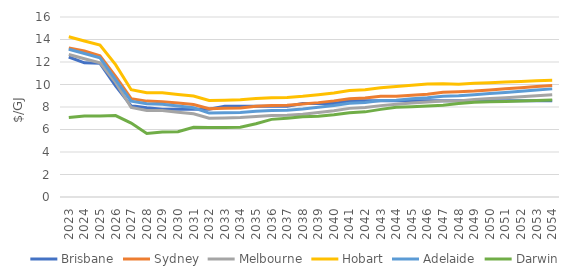
| Category | Brisbane | Sydney | Melbourne | Hobart | Adelaide | Darwin |
|---|---|---|---|---|---|---|
| 2023.0 | 12.443 | 13.236 | 12.663 | 14.242 | 13.139 | 7.075 |
| 2024.0 | 11.925 | 12.981 | 12.289 | 13.867 | 12.757 | 7.209 |
| 2025.0 | 11.88 | 12.56 | 11.934 | 13.513 | 12.367 | 7.206 |
| 2026.0 | 9.884 | 10.711 | 10.184 | 11.763 | 10.441 | 7.235 |
| 2027.0 | 8.104 | 8.745 | 7.957 | 9.54 | 8.515 | 6.574 |
| 2028.0 | 7.939 | 8.523 | 7.69 | 9.273 | 8.293 | 5.653 |
| 2029.0 | 7.806 | 8.475 | 7.683 | 9.266 | 8.254 | 5.783 |
| 2030.0 | 7.806 | 8.353 | 7.535 | 9.117 | 8.095 | 5.809 |
| 2031.0 | 7.806 | 8.227 | 7.394 | 8.977 | 7.928 | 6.205 |
| 2032.0 | 7.806 | 7.847 | 6.999 | 8.582 | 7.46 | 6.168 |
| 2033.0 | 8.056 | 7.89 | 7.022 | 8.604 | 7.483 | 6.179 |
| 2034.0 | 8.056 | 7.922 | 7.058 | 8.64 | 7.519 | 6.197 |
| 2035.0 | 8.056 | 8.061 | 7.166 | 8.748 | 7.626 | 6.513 |
| 2036.0 | 8.056 | 8.134 | 7.238 | 8.82 | 7.699 | 6.9 |
| 2037.0 | 8.056 | 8.157 | 7.257 | 8.839 | 7.718 | 7.001 |
| 2038.0 | 8.306 | 8.265 | 7.365 | 8.947 | 7.826 | 7.128 |
| 2039.0 | 8.306 | 8.388 | 7.507 | 9.09 | 7.968 | 7.169 |
| 2040.0 | 8.306 | 8.544 | 7.667 | 9.25 | 8.128 | 7.308 |
| 2041.0 | 8.556 | 8.742 | 7.878 | 9.46 | 8.339 | 7.495 |
| 2042.0 | 8.556 | 8.8 | 7.95 | 9.532 | 8.41 | 7.568 |
| 2043.0 | 8.556 | 8.951 | 8.122 | 9.705 | 8.577 | 7.79 |
| 2044.0 | 8.556 | 8.95 | 8.246 | 9.829 | 8.611 | 7.979 |
| 2045.0 | 8.556 | 9.044 | 8.36 | 9.942 | 8.724 | 8.03 |
| 2046.0 | 8.556 | 9.131 | 8.453 | 10.035 | 8.817 | 8.082 |
| 2047.0 | 8.556 | 9.301 | 8.526 | 10.06 | 8.96 | 8.145 |
| 2048.0 | 8.556 | 9.358 | 8.543 | 10.033 | 9.004 | 8.303 |
| 2049.0 | 8.556 | 9.423 | 8.66 | 10.101 | 9.097 | 8.414 |
| 2050.0 | 8.556 | 9.52 | 8.746 | 10.157 | 9.198 | 8.456 |
| 2051.0 | 8.556 | 9.619 | 8.832 | 10.212 | 9.299 | 8.498 |
| 2052.0 | 8.556 | 9.719 | 8.919 | 10.268 | 9.402 | 8.541 |
| 2053.0 | 8.556 | 9.819 | 9.007 | 10.325 | 9.506 | 8.583 |
| 2054.0 | 8.556 | 9.921 | 9.095 | 10.381 | 9.611 | 8.626 |